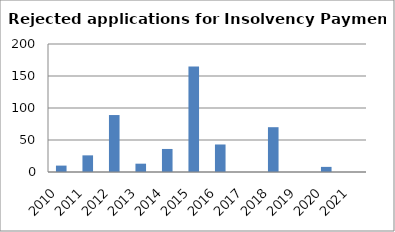
| Category | Series 0 |
|---|---|
| 2010.0 | 10 |
| 2011.0 | 26 |
| 2012.0 | 89 |
| 2013.0 | 13 |
| 2014.0 | 36 |
| 2015.0 | 165 |
| 2016.0 | 43 |
| 2017.0 | 0 |
| 2018.0 | 70 |
| 2019.0 | 0 |
| 2020.0 | 8 |
| 2021.0 | 0 |